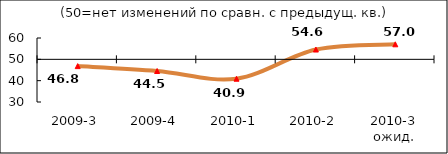
| Category | Диф.индекс ↓ |
|---|---|
| 2009-3 | 46.82 |
| 2009-4 | 44.53 |
| 2010-1 | 40.91 |
| 2010-2 | 54.59 |
| 2010-3 ожид. | 57.045 |